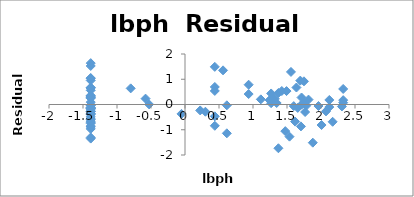
| Category | Series 0 |
|---|---|
| -1.38629436 | -1.305 |
| -1.38629436 | -0.887 |
| -1.38629436 | -0.706 |
| -1.38629436 | -0.747 |
| -1.38629436 | -1.35 |
| -1.38629436 | -0.042 |
| 0.61518564 | -1.141 |
| 1.53686722 | -1.273 |
| -1.38629436 | -0.12 |
| -1.38629436 | -0.259 |
| -1.38629436 | -0.182 |
| 1.2669476 | 0.437 |
| -1.38629436 | -0.853 |
| -1.38629436 | -0.572 |
| -1.38629436 | -0.659 |
| -1.38629436 | -0.491 |
| 1.24415459 | 0.173 |
| -1.38629436 | -0.966 |
| -1.38629436 | 0.27 |
| 1.65822808 | -0.135 |
| -1.38629436 | -0.368 |
| 1.47476301 | -1.055 |
| -0.7985077 | 0.639 |
| 0.43825493 | -0.843 |
| 1.59938758 | -0.064 |
| 0.30010459 | -0.286 |
| -1.38629436 | -0.153 |
| 1.81645208 | 0.194 |
| 0.22314355 | -0.235 |
| -1.38629436 | -0.399 |
| 1.96290773 | -0.06 |
| 1.70474809 | -0.867 |
| 1.2669476 | 0.051 |
| -1.38629436 | 0.653 |
| -1.38629436 | 0.953 |
| 2.17133681 | -0.685 |
| -0.5798185 | 0.232 |
| -1.38629436 | 1.05 |
| 1.37371558 | -1.733 |
| 0.93609336 | 0.414 |
| -1.38629436 | 0.248 |
| -1.38629436 | 0.094 |
| 1.71379793 | 0.277 |
| -1.38629436 | -0.017 |
| 1.74919985 | 0.087 |
| 0.61518564 | -0.033 |
| 1.87946505 | -1.512 |
| 1.71379793 | -0.008 |
| -1.38629436 | -0.117 |
| 1.37371558 | 0.456 |
| -1.38629436 | 0.327 |
| 2.07317193 | -0.273 |
| 1.4929041 | 0.532 |
| 1.76644166 | -0.298 |
| -1.38629436 | -0.592 |
| 2.12226154 | -0.101 |
| -1.38629436 | 1.035 |
| 1.42310833 | 0.535 |
| 0.43825493 | 0.695 |
| 1.29472717 | 0.186 |
| 2.32630162 | 0.615 |
| 1.61938824 | -0.677 |
| -1.38629436 | -0.157 |
| 2.00821403 | -0.812 |
| -1.38629436 | 0.337 |
| 1.32175584 | 0.223 |
| 1.78339122 | -0.048 |
| 2.30757263 | -0.078 |
| -1.38629436 | 1.638 |
| 2.32630162 | 0.172 |
| -1.38629436 | -0.271 |
| 1.74919985 | 0.918 |
| -1.38629436 | 0.29 |
| 0.43825493 | -0.469 |
| -1.38629436 | -0.372 |
| -0.05129329 | -0.371 |
| 2.12226154 | 0.18 |
| 2.32630162 | 0.073 |
| -1.38629436 | -0.017 |
| -1.38629436 | 0.357 |
| 0.55961579 | 1.352 |
| 0.43825493 | 0.538 |
| -0.52763274 | 0.004 |
| 1.11514159 | 0.204 |
| 1.69561561 | 0.946 |
| -1.38629436 | -0.279 |
| 1.63899671 | 0.673 |
| -1.38629436 | 0.675 |
| -1.38629436 | -0.146 |
| 0.93609336 | 0.784 |
| -1.38629436 | 0.657 |
| 1.34807315 | 0.059 |
| -1.38629436 | 0.562 |
| -1.38629436 | -0.021 |
| -1.38629436 | 1.526 |
| 1.55814462 | 1.29 |
| 0.43825493 | 1.491 |